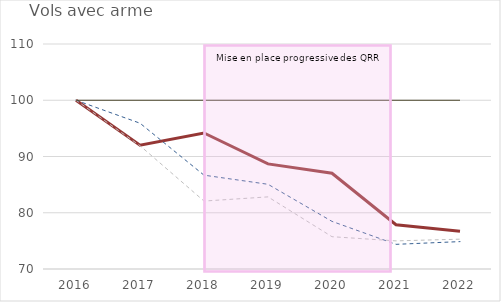
| Category | QRR | Unités urbaines englobantes | Unités urbaines de plus de 10 000 hab. | Series 0 |
|---|---|---|---|---|
| 2016.0 | 100 | 100 | 100 | 100 |
| 2017.0 | 92.013 | 95.92 | 91.921 | 100 |
| 2018.0 | 94.176 | 86.68 | 82.077 | 100 |
| 2019.0 | 88.686 | 85.06 | 82.822 | 100 |
| 2020.0 | 87.022 | 78.465 | 75.742 | 100 |
| 2021.0 | 77.87 | 74.385 | 74.997 | 100 |
| 2022.0 | 76.705 | 74.87 | 75.303 | 100 |